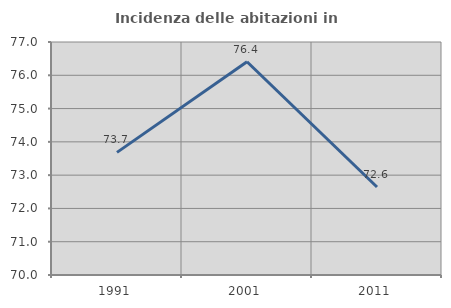
| Category | Incidenza delle abitazioni in proprietà  |
|---|---|
| 1991.0 | 73.684 |
| 2001.0 | 76.407 |
| 2011.0 | 72.643 |